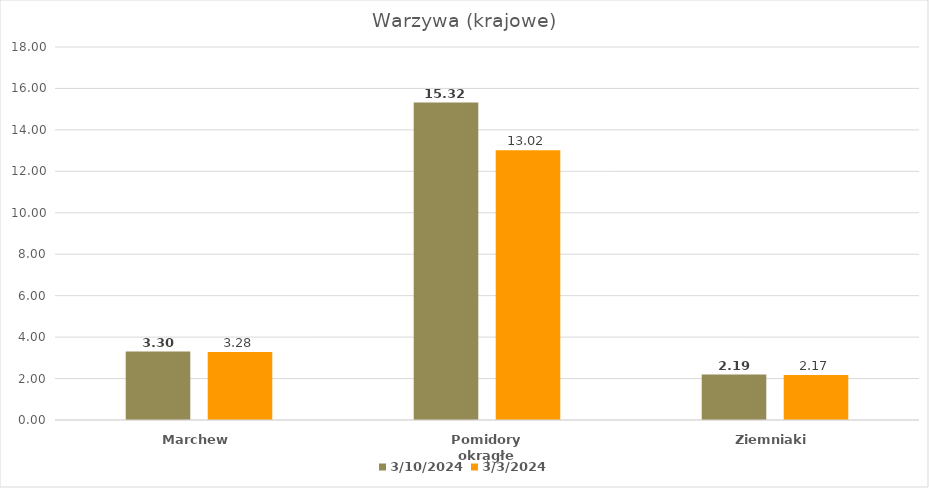
| Category | 2024-03-10 | 2024-03-03 |
|---|---|---|
| Marchew | 3.3 | 3.28 |
| Pomidory okrągłe | 15.32 | 13.02 |
| Ziemniaki | 2.19 | 2.17 |